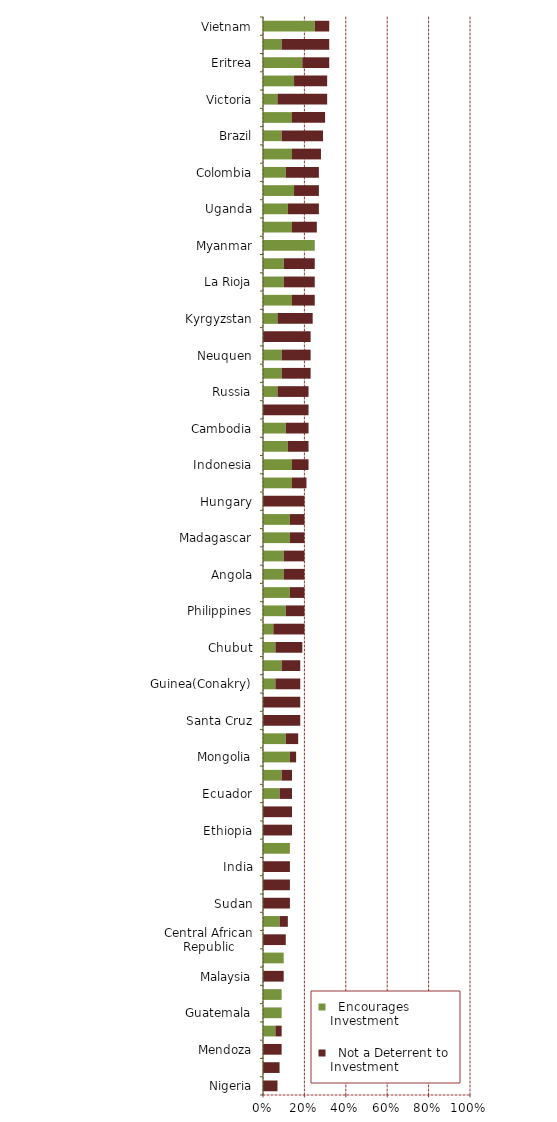
| Category |   Encourages Investment |   Not a Deterrent to Investment |
|---|---|---|
| Nigeria | 0 | 0.07 |
| Kenya | 0 | 0.08 |
| Mendoza | 0 | 0.09 |
| China | 0.06 | 0.03 |
| Guatemala | 0.09 | 0 |
| Honduras | 0.09 | 0 |
| Malaysia | 0 | 0.1 |
| Bolivia | 0.1 | 0 |
| Central African Republic | 0 | 0.11 |
| Zimbabwe | 0.08 | 0.04 |
| Sudan | 0 | 0.13 |
| Dominican Republic | 0 | 0.13 |
| India | 0 | 0.13 |
| Thailand | 0.13 | 0 |
| Ethiopia | 0 | 0.14 |
| Niger | 0 | 0.14 |
| Ecuador | 0.08 | 0.06 |
| Venezuela | 0.09 | 0.05 |
| Mongolia | 0.13 | 0.03 |
| California | 0.11 | 0.06 |
| Santa Cruz | 0 | 0.18 |
| Romania | 0 | 0.18 |
| Guinea(Conakry) | 0.06 | 0.12 |
| South Sudan | 0.09 | 0.09 |
| Chubut | 0.06 | 0.13 |
| Washington | 0.05 | 0.15 |
| Philippines | 0.11 | 0.09 |
| Solomon Islands | 0.13 | 0.07 |
| Angola | 0.1 | 0.1 |
| Egypt | 0.1 | 0.1 |
| Madagascar | 0.13 | 0.07 |
| Mauritania | 0.13 | 0.07 |
| Hungary | 0 | 0.2 |
| Suriname | 0.14 | 0.07 |
| Indonesia | 0.14 | 0.08 |
| Papua New Guinea | 0.12 | 0.1 |
| Cambodia | 0.11 | 0.11 |
| Bulgaria | 0 | 0.22 |
| Russia | 0.07 | 0.15 |
| Sierra Leone | 0.09 | 0.14 |
| Neuquen | 0.09 | 0.14 |
| Greece | 0 | 0.23 |
| Kyrgyzstan | 0.07 | 0.17 |
| Democratic Republic of Congo (DRC) | 0.14 | 0.11 |
| La Rioja | 0.1 | 0.15 |
| Laos | 0.1 | 0.15 |
| Myanmar | 0.25 | 0 |
| South Africa | 0.14 | 0.12 |
| Uganda | 0.12 | 0.15 |
| Rio Negro | 0.15 | 0.12 |
| Colombia | 0.11 | 0.16 |
| Montana | 0.14 | 0.14 |
| Brazil | 0.09 | 0.2 |
| Mali | 0.14 | 0.16 |
| Victoria | 0.07 | 0.24 |
| Jujuy | 0.15 | 0.16 |
| Eritrea | 0.19 | 0.13 |
| Kazakhstan | 0.09 | 0.23 |
| Vietnam | 0.25 | 0.07 |